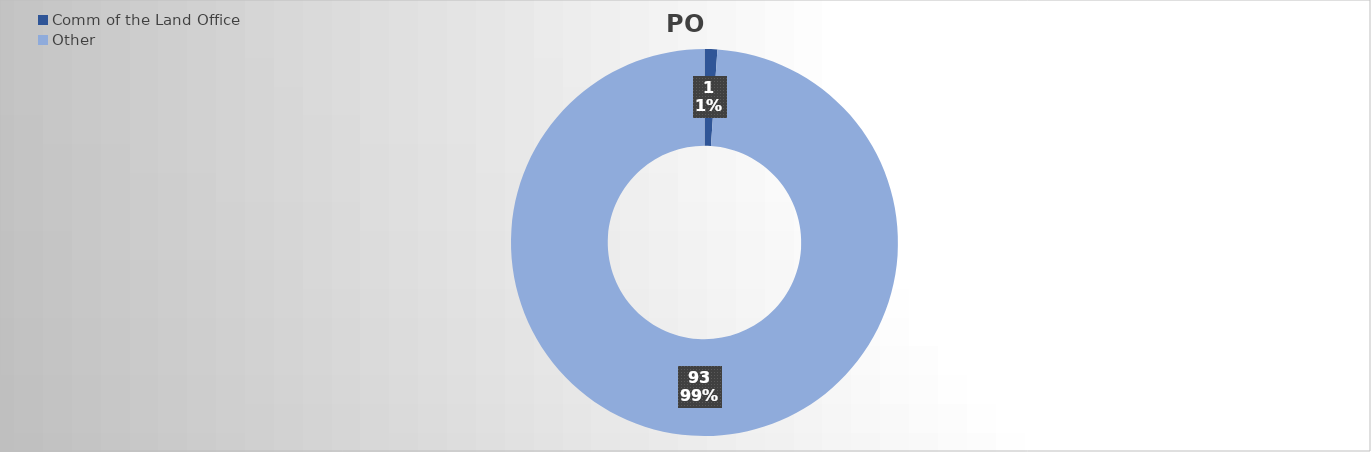
| Category | PO Lines |
|---|---|
| Comm of the Land Office | 1 |
| Other | 93 |